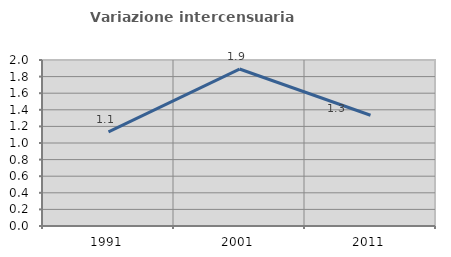
| Category | Variazione intercensuaria annua |
|---|---|
| 1991.0 | 1.134 |
| 2001.0 | 1.891 |
| 2011.0 | 1.334 |